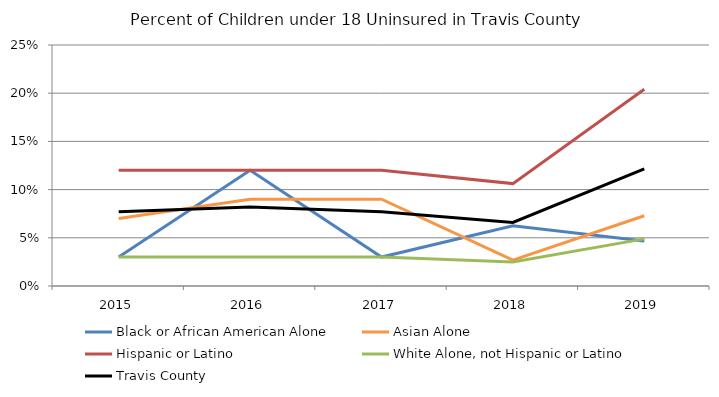
| Category | Black or African American Alone | Asian Alone | Hispanic or Latino | White Alone, not Hispanic or Latino | Travis County |
|---|---|---|---|---|---|
| 2015.0 | 0.03 | 0.07 | 0.12 | 0.03 | 0.077 |
| 2016.0 | 0.12 | 0.09 | 0.12 | 0.03 | 0.082 |
| 2017.0 | 0.03 | 0.09 | 0.12 | 0.03 | 0.077 |
| 2018.0 | 0.062 | 0.027 | 0.106 | 0.025 | 0.066 |
| 2019.0 | 0.047 | 0.073 | 0.204 | 0.049 | 0.122 |